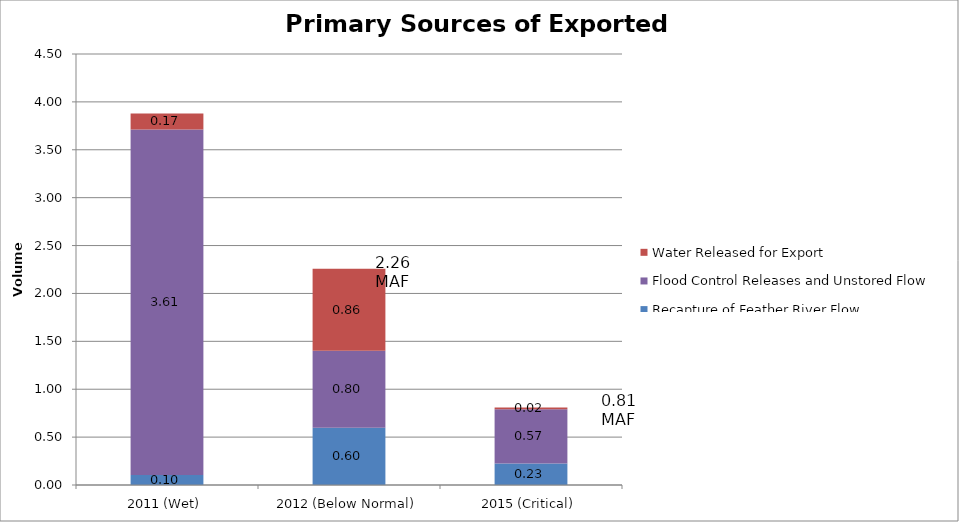
| Category | Recapture of Feather River Flow Requirements | Flood Control Releases and Unstored Flow | Water Released for Export |
|---|---|---|---|
| 2011 (Wet) | 0.105 | 3.608 | 0.167 |
| 2012 (Below Normal) | 0.598 | 0.805 | 0.856 |
| 2015 (Critical) | 0.225 | 0.565 | 0.019 |